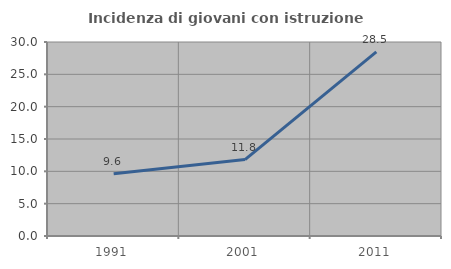
| Category | Incidenza di giovani con istruzione universitaria |
|---|---|
| 1991.0 | 9.639 |
| 2001.0 | 11.818 |
| 2011.0 | 28.47 |